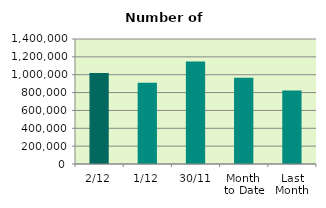
| Category | Series 0 |
|---|---|
| 2/12 | 1020486 |
| 1/12 | 909848 |
| 30/11 | 1147918 |
| Month 
to Date | 965167 |
| Last
Month | 823936.455 |